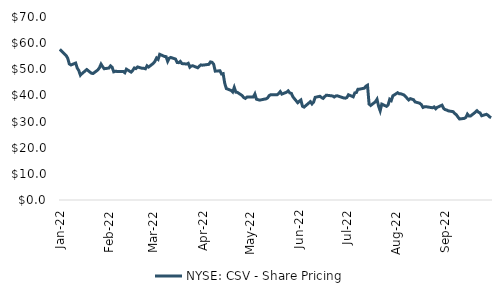
| Category | NYSE: CSV - Share Pricing |
|---|---|
| 2022-01-14 | 57.617 |
| 2022-01-18 | 55.257 |
| 2022-01-19 | 54.206 |
| 2022-01-20 | 52.044 |
| 2022-01-21 | 51.647 |
| 2022-01-24 | 52.391 |
| 2022-01-25 | 50.477 |
| 2022-01-26 | 49.505 |
| 2022-01-27 | 47.73 |
| 2022-01-28 | 48.345 |
| 2022-01-31 | 49.902 |
| 2022-02-01 | 49.416 |
| 2022-02-02 | 48.94 |
| 2022-02-03 | 48.484 |
| 2022-02-04 | 48.397 |
| 2022-02-07 | 49.769 |
| 2022-02-08 | 50.594 |
| 2022-02-09 | 51.975 |
| 2022-02-10 | 51.001 |
| 2022-02-11 | 50.206 |
| 2022-02-14 | 50.494 |
| 2022-02-15 | 51.3 |
| 2022-02-16 | 50.783 |
| 2022-02-17 | 49.023 |
| 2022-02-18 | 49.202 |
| 2022-02-22 | 49.192 |
| 2022-02-23 | 49.182 |
| 2022-02-24 | 48.685 |
| 2022-02-25 | 50.037 |
| 2022-02-28 | 48.914 |
| 2022-03-01 | 49.59 |
| 2022-03-02 | 50.504 |
| 2022-03-03 | 50.266 |
| 2022-03-04 | 50.902 |
| 2022-03-07 | 50.355 |
| 2022-03-08 | 50.375 |
| 2022-03-09 | 50.186 |
| 2022-03-10 | 51.329 |
| 2022-03-11 | 50.852 |
| 2022-03-14 | 52.294 |
| 2022-03-15 | 53.039 |
| 2022-03-16 | 54.321 |
| 2022-03-17 | 53.804 |
| 2022-03-18 | 55.723 |
| 2022-03-21 | 54.918 |
| 2022-03-22 | 54.838 |
| 2022-03-23 | 53.029 |
| 2022-03-24 | 54.262 |
| 2022-03-25 | 54.53 |
| 2022-03-28 | 53.894 |
| 2022-03-29 | 52.602 |
| 2022-03-30 | 52.532 |
| 2022-03-31 | 53.009 |
| 2022-04-01 | 52.174 |
| 2022-04-04 | 52.015 |
| 2022-04-05 | 52.303 |
| 2022-04-06 | 50.803 |
| 2022-04-07 | 51.3 |
| 2022-04-08 | 51.31 |
| 2022-04-11 | 50.574 |
| 2022-04-12 | 51.22 |
| 2022-04-13 | 51.687 |
| 2022-04-14 | 51.568 |
| 2022-04-18 | 51.896 |
| 2022-04-19 | 52.82 |
| 2022-04-20 | 52.671 |
| 2022-04-21 | 51.956 |
| 2022-04-22 | 49.292 |
| 2022-04-25 | 49.431 |
| 2022-04-26 | 48.188 |
| 2022-04-27 | 48.328 |
| 2022-04-28 | 44.6 |
| 2022-04-29 | 42.632 |
| 2022-05-02 | 41.896 |
| 2022-05-03 | 41.32 |
| 2022-05-04 | 43.079 |
| 2022-05-05 | 41.24 |
| 2022-05-06 | 41.164 |
| 2022-05-09 | 39.938 |
| 2022-05-10 | 39.16 |
| 2022-05-11 | 38.861 |
| 2022-05-12 | 39.36 |
| 2022-05-13 | 39.39 |
| 2022-05-16 | 39.39 |
| 2022-05-17 | 40.536 |
| 2022-05-18 | 38.552 |
| 2022-05-19 | 38.373 |
| 2022-05-20 | 38.204 |
| 2022-05-23 | 38.582 |
| 2022-05-24 | 38.672 |
| 2022-05-25 | 39.031 |
| 2022-05-26 | 39.918 |
| 2022-05-27 | 40.287 |
| 2022-05-31 | 40.237 |
| 2022-06-01 | 40.735 |
| 2022-06-02 | 41.463 |
| 2022-06-03 | 40.506 |
| 2022-06-06 | 41.233 |
| 2022-06-07 | 41.752 |
| 2022-06-08 | 40.964 |
| 2022-06-09 | 40.785 |
| 2022-06-10 | 39.439 |
| 2022-06-13 | 37.217 |
| 2022-06-14 | 37.785 |
| 2022-06-15 | 38.253 |
| 2022-06-16 | 35.861 |
| 2022-06-17 | 35.522 |
| 2022-06-21 | 37.615 |
| 2022-06-22 | 36.758 |
| 2022-06-23 | 37.436 |
| 2022-06-24 | 39.27 |
| 2022-06-27 | 39.679 |
| 2022-06-28 | 39.21 |
| 2022-06-29 | 38.881 |
| 2022-06-30 | 39.519 |
| 2022-07-01 | 40.097 |
| 2022-07-05 | 39.798 |
| 2022-07-06 | 39.41 |
| 2022-07-07 | 39.808 |
| 2022-07-08 | 39.848 |
| 2022-07-11 | 39.24 |
| 2022-07-12 | 39.041 |
| 2022-07-13 | 38.951 |
| 2022-07-14 | 39.19 |
| 2022-07-15 | 40.257 |
| 2022-07-18 | 39.469 |
| 2022-07-19 | 40.974 |
| 2022-07-20 | 41.114 |
| 2022-07-21 | 42.38 |
| 2022-07-22 | 42.4 |
| 2022-07-25 | 42.768 |
| 2022-07-26 | 43.526 |
| 2022-07-27 | 43.905 |
| 2022-07-28 | 36.718 |
| 2022-07-29 | 36.16 |
| 2022-08-01 | 37.576 |
| 2022-08-02 | 38.532 |
| 2022-08-03 | 35.881 |
| 2022-08-04 | 34.127 |
| 2022-08-05 | 36.68 |
| 2022-08-08 | 35.82 |
| 2022-08-09 | 36.38 |
| 2022-08-10 | 38.52 |
| 2022-08-11 | 38.04 |
| 2022-08-12 | 39.85 |
| 2022-08-15 | 41.03 |
| 2022-08-16 | 40.63 |
| 2022-08-17 | 40.63 |
| 2022-08-18 | 40.41 |
| 2022-08-19 | 40.18 |
| 2022-08-22 | 38.27 |
| 2022-08-23 | 38.77 |
| 2022-08-24 | 38.56 |
| 2022-08-25 | 38.38 |
| 2022-08-26 | 37.52 |
| 2022-08-29 | 37.01 |
| 2022-08-30 | 36.43 |
| 2022-08-31 | 35.41 |
| 2022-09-01 | 35.66 |
| 2022-09-02 | 35.68 |
| 2022-09-06 | 35.27 |
| 2022-09-07 | 35.61 |
| 2022-09-08 | 34.9 |
| 2022-09-09 | 35.45 |
| 2022-09-12 | 36.28 |
| 2022-09-13 | 35.02 |
| 2022-09-14 | 34.56 |
| 2022-09-15 | 34.41 |
| 2022-09-16 | 34.09 |
| 2022-09-19 | 33.78 |
| 2022-09-20 | 33.07 |
| 2022-09-21 | 32.65 |
| 2022-09-22 | 31.77 |
| 2022-09-23 | 30.99 |
| 2022-09-26 | 31.21 |
| 2022-09-27 | 31.58 |
| 2022-09-28 | 32.84 |
| 2022-09-29 | 32.12 |
| 2022-09-30 | 32.16 |
| 2022-10-03 | 33.57 |
| 2022-10-04 | 34.16 |
| 2022-10-05 | 33.59 |
| 2022-10-06 | 33.31 |
| 2022-10-07 | 32.23 |
| 2022-10-10 | 32.78 |
| 2022-10-11 | 32.39 |
| 2022-10-12 | 31.79 |
| 2022-10-13 | 31.49 |